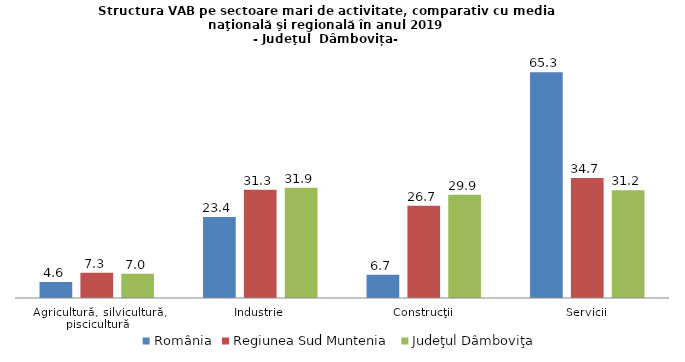
| Category | România | Regiunea Sud Muntenia | Judeţul Dâmboviţa |
|---|---|---|---|
| Agricultură, silvicultură, piscicultură | 4.6 | 7.3 | 7 |
| Industrie | 23.4 | 31.3 | 31.9 |
| Construcţii | 6.7 | 26.7 | 29.9 |
| Servicii | 65.3 | 34.7 | 31.2 |